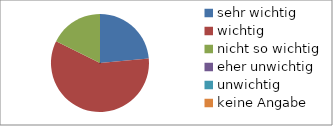
| Category | Series 0 |
|---|---|
| sehr wichtig | 4 |
| wichtig | 10 |
| nicht so wichtig | 3 |
| eher unwichtig | 0 |
| unwichtig | 0 |
| keine Angabe | 0 |